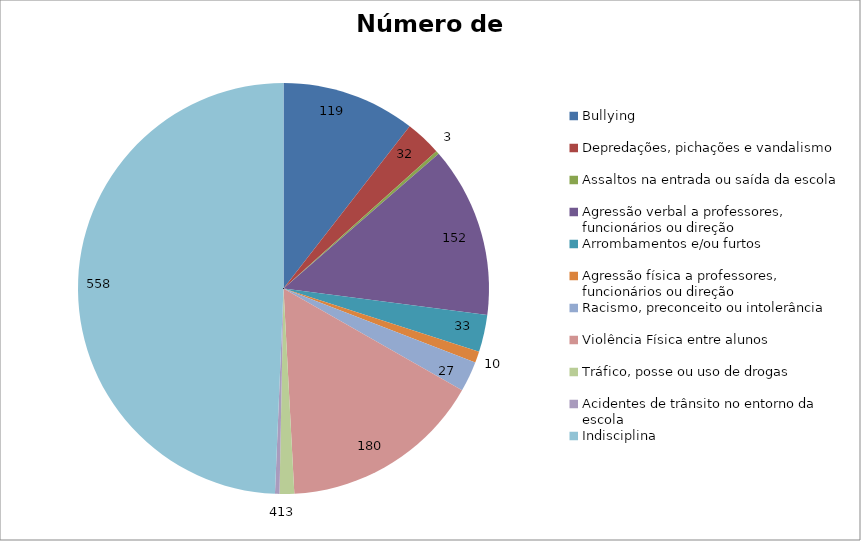
| Category | Número de Casos |
|---|---|
| Bullying | 119 |
| Depredações, pichações e vandalismo | 32 |
| Assaltos na entrada ou saída da escola | 3 |
| Agressão verbal a professores, funcionários ou direção | 152 |
| Arrombamentos e/ou furtos | 33 |
| Agressão física a professores, funcionários ou direção | 10 |
| Racismo, preconceito ou intolerância | 27 |
| Violência Física entre alunos | 180 |
| Tráfico, posse ou uso de drogas | 13 |
| Acidentes de trânsito no entorno da escola | 4 |
| Indisciplina | 558 |